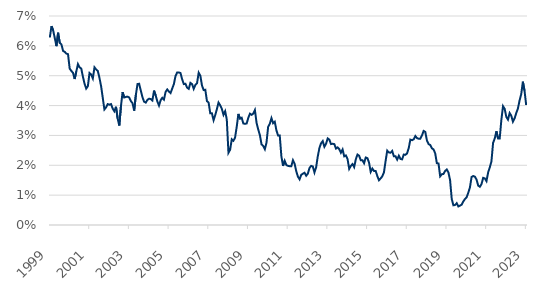
| Category | Series 0 |
|---|---|
| 1999-12-31 | 6.28 |
| 2000-01-31 | 6.66 |
| 2000-02-29 | 6.52 |
| 2000-03-31 | 6.26 |
| 2000-04-30 | 5.99 |
| 2000-05-31 | 6.44 |
| 2000-06-30 | 6.1 |
| 2000-07-31 | 6.05 |
| 2000-08-31 | 5.83 |
| 2000-09-30 | 5.8 |
| 2000-10-31 | 5.74 |
| 2000-11-30 | 5.72 |
| 2000-12-31 | 5.24 |
| 2001-01-31 | 5.16 |
| 2001-02-28 | 5.1 |
| 2001-03-31 | 4.89 |
| 2001-04-30 | 5.14 |
| 2001-05-31 | 5.39 |
| 2001-06-30 | 5.28 |
| 2001-07-31 | 5.24 |
| 2001-08-31 | 4.97 |
| 2001-09-30 | 4.73 |
| 2001-10-31 | 4.57 |
| 2001-11-30 | 4.65 |
| 2001-12-31 | 5.09 |
| 2002-01-31 | 5.04 |
| 2002-02-28 | 4.91 |
| 2002-03-31 | 5.28 |
| 2002-04-30 | 5.21 |
| 2002-05-31 | 5.16 |
| 2002-06-30 | 4.93 |
| 2002-07-31 | 4.65 |
| 2002-08-31 | 4.26 |
| 2002-09-30 | 3.87 |
| 2002-10-31 | 3.94 |
| 2002-11-30 | 4.05 |
| 2002-12-31 | 4.03 |
| 2003-01-31 | 4.05 |
| 2003-02-28 | 3.9 |
| 2003-03-31 | 3.81 |
| 2003-04-30 | 3.96 |
| 2003-05-31 | 3.57 |
| 2003-06-30 | 3.33 |
| 2003-07-31 | 3.98 |
| 2003-08-31 | 4.45 |
| 2003-09-30 | 4.27 |
| 2003-10-31 | 4.29 |
| 2003-11-30 | 4.3 |
| 2003-12-31 | 4.27 |
| 2004-01-31 | 4.15 |
| 2004-02-29 | 4.08 |
| 2004-03-31 | 3.83 |
| 2004-04-30 | 4.35 |
| 2004-05-31 | 4.72 |
| 2004-06-30 | 4.73 |
| 2004-07-31 | 4.5 |
| 2004-08-31 | 4.28 |
| 2004-09-30 | 4.13 |
| 2004-10-31 | 4.1 |
| 2004-11-30 | 4.19 |
| 2004-12-31 | 4.23 |
| 2005-01-31 | 4.22 |
| 2005-02-28 | 4.17 |
| 2005-03-31 | 4.5 |
| 2005-04-30 | 4.34 |
| 2005-05-31 | 4.14 |
| 2005-06-30 | 4 |
| 2005-07-31 | 4.18 |
| 2005-08-31 | 4.26 |
| 2005-09-30 | 4.2 |
| 2005-10-31 | 4.46 |
| 2005-11-30 | 4.54 |
| 2005-12-31 | 4.47 |
| 2006-01-31 | 4.42 |
| 2006-02-28 | 4.57 |
| 2006-03-31 | 4.72 |
| 2006-04-30 | 4.99 |
| 2006-05-31 | 5.11 |
| 2006-06-30 | 5.11 |
| 2006-07-31 | 5.09 |
| 2006-08-31 | 4.88 |
| 2006-09-30 | 4.72 |
| 2006-10-31 | 4.73 |
| 2006-11-30 | 4.6 |
| 2006-12-31 | 4.56 |
| 2007-01-31 | 4.76 |
| 2007-02-28 | 4.72 |
| 2007-03-31 | 4.56 |
| 2007-04-30 | 4.69 |
| 2007-05-31 | 4.75 |
| 2007-06-30 | 5.1 |
| 2007-07-31 | 5 |
| 2007-08-31 | 4.67 |
| 2007-09-30 | 4.52 |
| 2007-10-31 | 4.53 |
| 2007-11-30 | 4.15 |
| 2007-12-31 | 4.1 |
| 2008-01-31 | 3.74 |
| 2008-02-29 | 3.74 |
| 2008-03-31 | 3.51 |
| 2008-04-30 | 3.68 |
| 2008-05-31 | 3.88 |
| 2008-06-30 | 4.1 |
| 2008-07-31 | 4.01 |
| 2008-08-31 | 3.89 |
| 2008-09-30 | 3.69 |
| 2008-10-31 | 3.81 |
| 2008-11-30 | 3.53 |
| 2008-12-31 | 2.42 |
| 2009-01-31 | 2.52 |
| 2009-02-28 | 2.87 |
| 2009-03-31 | 2.82 |
| 2009-04-30 | 2.93 |
| 2009-05-31 | 3.29 |
| 2009-06-30 | 3.72 |
| 2009-07-31 | 3.56 |
| 2009-08-31 | 3.59 |
| 2009-09-30 | 3.4 |
| 2009-10-31 | 3.39 |
| 2009-11-30 | 3.4 |
| 2009-12-31 | 3.59 |
| 2010-01-31 | 3.73 |
| 2010-02-28 | 3.69 |
| 2010-03-31 | 3.73 |
| 2010-04-30 | 3.85 |
| 2010-05-31 | 3.42 |
| 2010-06-30 | 3.2 |
| 2010-07-31 | 3.01 |
| 2010-08-31 | 2.7 |
| 2010-09-30 | 2.65 |
| 2010-10-31 | 2.54 |
| 2010-11-30 | 2.76 |
| 2010-12-31 | 3.29 |
| 2011-01-31 | 3.39 |
| 2011-02-28 | 3.58 |
| 2011-03-31 | 3.41 |
| 2011-04-30 | 3.46 |
| 2011-05-31 | 3.17 |
| 2011-06-30 | 3 |
| 2011-07-31 | 3 |
| 2011-08-31 | 2.3 |
| 2011-09-30 | 1.98 |
| 2011-10-31 | 2.15 |
| 2011-11-30 | 2.01 |
| 2011-12-31 | 1.98 |
| 2012-01-31 | 1.97 |
| 2012-02-29 | 1.97 |
| 2012-03-31 | 2.17 |
| 2012-04-30 | 2.05 |
| 2012-05-31 | 1.8 |
| 2012-06-30 | 1.62 |
| 2012-07-31 | 1.53 |
| 2012-08-31 | 1.68 |
| 2012-09-30 | 1.72 |
| 2012-10-31 | 1.75 |
| 2012-11-30 | 1.65 |
| 2012-12-31 | 1.72 |
| 2013-01-31 | 1.91 |
| 2013-02-28 | 1.98 |
| 2013-03-31 | 1.96 |
| 2013-04-30 | 1.76 |
| 2013-05-31 | 1.93 |
| 2013-06-30 | 2.3 |
| 2013-07-31 | 2.58 |
| 2013-08-31 | 2.74 |
| 2013-09-30 | 2.81 |
| 2013-10-31 | 2.62 |
| 2013-11-30 | 2.72 |
| 2013-12-31 | 2.9 |
| 2014-01-31 | 2.86 |
| 2014-02-28 | 2.71 |
| 2014-03-31 | 2.72 |
| 2014-04-30 | 2.71 |
| 2014-05-31 | 2.56 |
| 2014-06-30 | 2.6 |
| 2014-07-31 | 2.54 |
| 2014-08-31 | 2.42 |
| 2014-09-30 | 2.53 |
| 2014-10-31 | 2.3 |
| 2014-11-30 | 2.33 |
| 2014-12-31 | 2.21 |
| 2015-01-31 | 1.88 |
| 2015-02-28 | 1.98 |
| 2015-03-31 | 2.04 |
| 2015-04-30 | 1.94 |
| 2015-05-31 | 2.2 |
| 2015-06-30 | 2.36 |
| 2015-07-31 | 2.32 |
| 2015-08-31 | 2.17 |
| 2015-09-30 | 2.17 |
| 2015-10-31 | 2.07 |
| 2015-11-30 | 2.26 |
| 2015-12-31 | 2.24 |
| 2016-01-31 | 2.09 |
| 2016-02-29 | 1.78 |
| 2016-03-31 | 1.89 |
| 2016-04-30 | 1.81 |
| 2016-05-31 | 1.81 |
| 2016-06-30 | 1.64 |
| 2016-07-31 | 1.5 |
| 2016-08-31 | 1.56 |
| 2016-09-30 | 1.63 |
| 2016-10-31 | 1.76 |
| 2016-11-30 | 2.14 |
| 2016-12-31 | 2.49 |
| 2017-01-31 | 2.43 |
| 2017-02-28 | 2.42 |
| 2017-03-31 | 2.48 |
| 2017-04-30 | 2.3 |
| 2017-05-31 | 2.3 |
| 2017-06-30 | 2.19 |
| 2017-07-31 | 2.32 |
| 2017-08-31 | 2.21 |
| 2017-09-30 | 2.2 |
| 2017-10-31 | 2.36 |
| 2017-11-30 | 2.35 |
| 2017-12-31 | 2.4 |
| 2018-01-31 | 2.58 |
| 2018-02-28 | 2.86 |
| 2018-03-31 | 2.84 |
| 2018-04-30 | 2.87 |
| 2018-05-31 | 2.98 |
| 2018-06-30 | 2.91 |
| 2018-07-31 | 2.89 |
| 2018-08-31 | 2.89 |
| 2018-09-30 | 3 |
| 2018-10-31 | 3.15 |
| 2018-11-30 | 3.12 |
| 2018-12-31 | 2.83 |
| 2019-01-31 | 2.71 |
| 2019-02-28 | 2.68 |
| 2019-03-31 | 2.57 |
| 2019-04-30 | 2.53 |
| 2019-05-31 | 2.4 |
| 2019-06-30 | 2.07 |
| 2019-07-31 | 2.06 |
| 2019-08-31 | 1.63 |
| 2019-09-30 | 1.7 |
| 2019-10-31 | 1.71 |
| 2019-11-30 | 1.81 |
| 2019-12-31 | 1.86 |
| 2020-01-31 | 1.76 |
| 2020-02-29 | 1.5 |
| 2020-03-31 | 0.87 |
| 2020-04-30 | 0.66 |
| 2020-05-31 | 0.67 |
| 2020-06-30 | 0.73 |
| 2020-07-31 | 0.62 |
| 2020-08-31 | 0.65 |
| 2020-09-30 | 0.68 |
| 2020-10-31 | 0.79 |
| 2020-11-30 | 0.87 |
| 2020-12-31 | 0.93 |
| 2021-01-31 | 1.08 |
| 2021-02-28 | 1.26 |
| 2021-03-31 | 1.61 |
| 2021-04-30 | 1.64 |
| 2021-05-31 | 1.62 |
| 2021-06-30 | 1.52 |
| 2021-07-31 | 1.32 |
| 2021-08-31 | 1.28 |
| 2021-09-30 | 1.37 |
| 2021-10-31 | 1.58 |
| 2021-11-30 | 1.56 |
| 2021-12-31 | 1.47 |
| 2022-01-31 | 1.76 |
| 2022-02-28 | 1.93 |
| 2022-03-31 | 2.13 |
| 2022-04-30 | 2.75 |
| 2022-05-31 | 2.9 |
| 2022-06-30 | 3.14 |
| 2022-07-31 | 2.9 |
| 2022-08-31 | 2.9 |
| 2022-09-30 | 3.52 |
| 2022-10-31 | 3.98 |
| 2022-11-30 | 3.89 |
| 2022-12-31 | 3.62 |
| 2023-01-31 | 3.53 |
| 2023-02-28 | 3.75 |
| 2023-03-31 | 3.66 |
| 2023-04-30 | 3.46 |
| 2023-05-31 | 3.57 |
| 2023-06-30 | 3.75 |
| 2023-07-31 | 3.9 |
| 2023-08-31 | 4.17 |
| 2023-09-30 | 4.38 |
| 2023-10-31 | 4.8 |
| 2023-11-30 | 4.5 |
| 2023-12-31 | 4.02 |